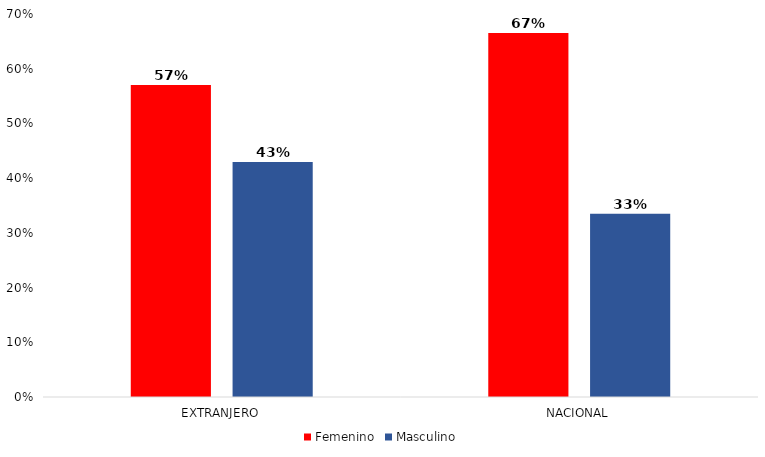
| Category | Femenino | Masculino |
|---|---|---|
| EXTRANJERO | 0.57 | 0.43 |
| NACIONAL | 0.665 | 0.335 |